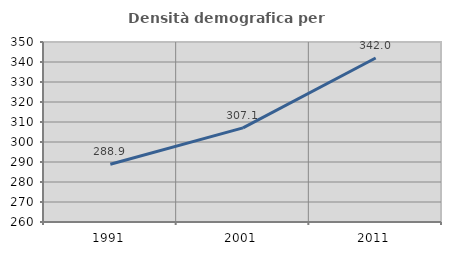
| Category | Densità demografica |
|---|---|
| 1991.0 | 288.874 |
| 2001.0 | 307.057 |
| 2011.0 | 342.023 |